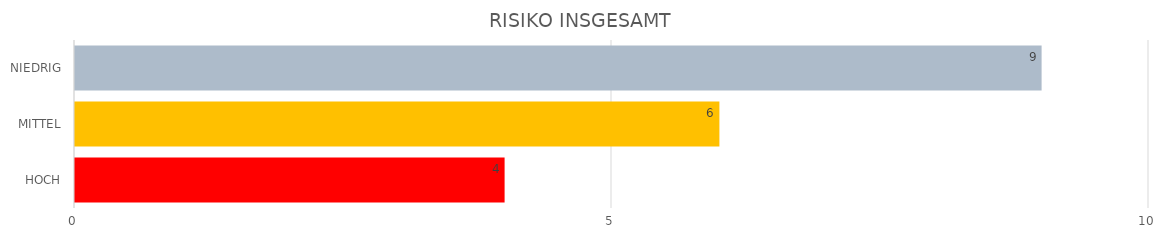
| Category | Series 1 | Series 0 |
|---|---|---|
| HOCH | 4 | 4 |
| MITTEL | 6 | 6 |
| NIEDRIG | 9 | 9 |